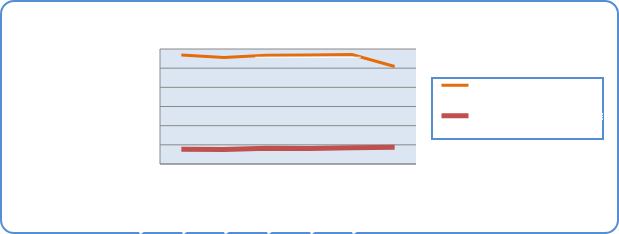
| Category | Motorin Türleri | Benzin Türleri |
|---|---|---|
| 5/13/19 | 56828241.294 | 7733855.401 |
| 5/14/19 | 55569032.137 | 7564732.978 |
| 5/15/19 | 56740268.377 | 8227711.658 |
| 5/16/19 | 56859866.164 | 8084935.936 |
| 5/17/19 | 57076006.424 | 8502748.243 |
| 5/18/19 | 50851103.495 | 8795109.223 |